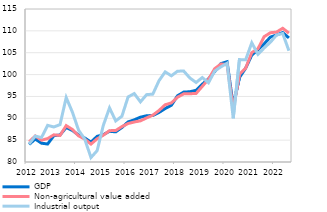
| Category | GDP | Non-agricultural value added | Industrial output |
|---|---|---|---|
| 2012 | 84.018 | 84.612 | 84.123 |
| II | 85.258 | 85.96 | 85.93 |
| III | 84.302 | 84.992 | 85.589 |
| IV | 84.116 | 85.358 | 88.385 |
| 2013 | 86.02 | 86.217 | 88.012 |
| II | 86.175 | 86.066 | 88.554 |
| III | 87.892 | 88.326 | 94.747 |
| IV | 87.218 | 87.438 | 91.408 |
| 2014 | 86.152 | 85.98 | 87.283 |
| II | 85.484 | 85.23 | 85.237 |
| III | 84.559 | 84.096 | 81.017 |
| IV | 85.868 | 85.308 | 82.596 |
| 2015 | 86.262 | 86.126 | 88.39 |
| II | 87.023 | 87.171 | 92.377 |
| III | 86.897 | 87.198 | 89.401 |
| IV | 87.886 | 88.099 | 90.454 |
| 2016 | 89.166 | 88.801 | 94.877 |
| II | 89.646 | 89.152 | 95.655 |
| III | 90.249 | 89.415 | 93.762 |
| IV | 90.577 | 90.087 | 95.414 |
| 2017 | 90.641 | 90.715 | 95.522 |
| II | 91.332 | 91.781 | 98.6 |
| III | 92.227 | 93.099 | 100.615 |
| IV | 92.975 | 93.517 | 99.718 |
| 2018 | 95.156 | 94.822 | 100.784 |
| II | 95.991 | 95.589 | 100.795 |
| III | 96.075 | 95.614 | 99.203 |
| IV | 96.399 | 95.689 | 98.191 |
| 2019 | 97.791 | 97.306 | 99.319 |
| II | 99.022 | 98.94 | 98.127 |
| III | 100.682 | 101.344 | 100.795 |
| IV | 102.505 | 102.41 | 101.76 |
| 2020 | 102.935 | 102.319 | 102.578 |
| II | 92.928 | 92.115 | 90 |
| III | 99.313 | 100.067 | 103.429 |
| IV | 101.448 | 101.436 | 103.366 |
| 2021 | 104.465 | 105.028 | 107.265 |
| II | 105.666 | 105.913 | 104.636 |
| III | 107.038 | 108.676 | 106.091 |
| IV | 108.563 | 109.568 | 107.387 |
| 2022 | 109.057 | 109.723 | 109.044 |
| II | 109.608 | 110.591 | 109.405 |
| III | 108.382 | 109.482 | 105.457 |